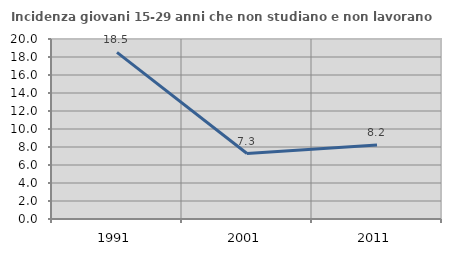
| Category | Incidenza giovani 15-29 anni che non studiano e non lavorano  |
|---|---|
| 1991.0 | 18.519 |
| 2001.0 | 7.273 |
| 2011.0 | 8.219 |